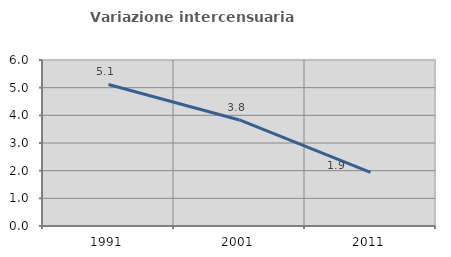
| Category | Variazione intercensuaria annua |
|---|---|
| 1991.0 | 5.115 |
| 2001.0 | 3.833 |
| 2011.0 | 1.936 |